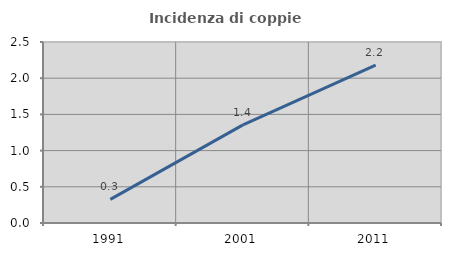
| Category | Incidenza di coppie miste |
|---|---|
| 1991.0 | 0.326 |
| 2001.0 | 1.356 |
| 2011.0 | 2.181 |